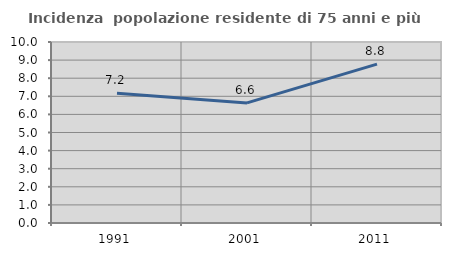
| Category | Incidenza  popolazione residente di 75 anni e più |
|---|---|
| 1991.0 | 7.175 |
| 2001.0 | 6.635 |
| 2011.0 | 8.775 |